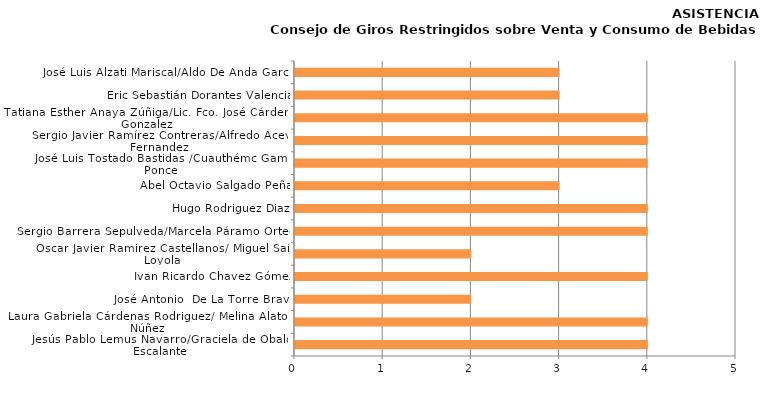
| Category | Series 0 |
|---|---|
| Jesús Pablo Lemus Navarro/Graciela de Obaldía Escalante | 4 |
| Laura Gabriela Cárdenas Rodriguez/ Melina Alatorre Núñez | 4 |
| José Antonio  De La Torre Bravo | 2 |
| Ivan Ricardo Chavez Gómez | 4 |
| Oscar Javier Ramirez Castellanos/ Miguel Saínz Loyola | 2 |
| Sergio Barrera Sepulveda/Marcela Páramo Ortega | 4 |
| Hugo Rodriguez Diaz | 4 |
| Abel Octavio Salgado Peña | 3 |
| José Luis Tostado Bastidas /Cuauthémc Gamez Ponce | 4 |
| Sergio Javier Ramírez Contreras/Alfredo Aceves Fernandez | 4 |
| Tatiana Esther Anaya Zúñiga/Lic. Fco. José Cárdenas Gonzalez | 4 |
| Eric Sebastián Dorantes Valencia | 3 |
| José Luis Alzati Mariscal/Aldo De Anda García | 3 |